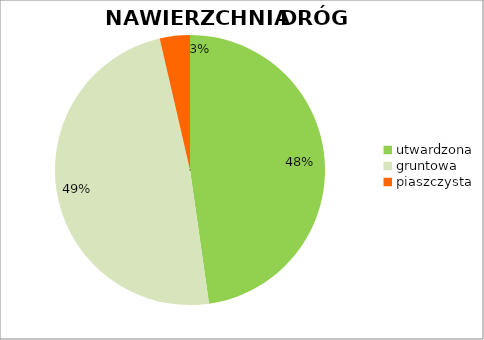
| Category | Series 0 |
|---|---|
| utwardzona | 0.477 |
| gruntowa | 0.486 |
| piaszczysta | 0.036 |